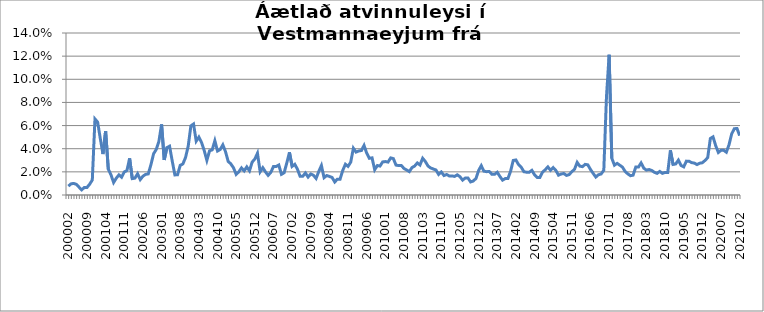
| Category | Series 0 |
|---|---|
| 200002 | 0.008 |
| 200003 | 0.01 |
| 200004 | 0.01 |
| 200005 | 0.009 |
| 200006 | 0.007 |
| 200007 | 0.004 |
| 200008 | 0.006 |
| 200009 | 0.006 |
| 200010 | 0.009 |
| 200011 | 0.013 |
| 200012 | 0.066 |
| 200101 | 0.063 |
| 200102 | 0.049 |
| 200103 | 0.035 |
| 200104 | 0.055 |
| 200105 | 0.022 |
| 200106 | 0.017 |
| 200107 | 0.011 |
| 200108 | 0.015 |
| 200109 | 0.017 |
| 200110 | 0.015 |
| 200111 | 0.02 |
| 200112 | 0.021 |
| 200201 | 0.032 |
| 200202 | 0.014 |
| 200203 | 0.015 |
| 200204 | 0.018 |
| 200205 | 0.013 |
| 200206 | 0.016 |
| 200207 | 0.018 |
| 200208 | 0.018 |
| 200209 | 0.026 |
| 200210 | 0.036 |
| 200211 | 0.039 |
| 200212 | 0.046 |
| 200301 | 0.061 |
| 200302 | 0.03 |
| 200303 | 0.041 |
| 200304 | 0.042 |
| 200305 | 0.029 |
| 200306 | 0.017 |
| 200307 | 0.017 |
| 200308 | 0.026 |
| 200309 | 0.027 |
| 200310 | 0.032 |
| 200311 | 0.042 |
| 200312 | 0.06 |
| 200401 | 0.061 |
| 200402 | 0.047 |
| 200403 | 0.05 |
| 200404 | 0.045 |
| 200405 | 0.038 |
| 200406 | 0.03 |
| 200407 | 0.038 |
| 200408 | 0.039 |
| 200409 | 0.047 |
| 200410 | 0.038 |
| 200411 | 0.039 |
| 200412 | 0.043 |
| 200501 | 0.037 |
| 200502 | 0.029 |
| 200503 | 0.027 |
| 200504 | 0.023 |
| 200505 | 0.018 |
| 200506 | 0.02 |
| 200507 | 0.023 |
| 200508 | 0.021 |
| 200509 | 0.024 |
| 200510 | 0.021 |
| 200511 | 0.028 |
| 200512 | 0.031 |
| 200601 | 0.036 |
| 200602 | 0.02 |
| 200603 | 0.024 |
| 200604 | 0.02 |
| 200605 | 0.017 |
| 200606 | 0.02 |
| 200607 | 0.025 |
| 200608 | 0.025 |
| 200609 | 0.026 |
| 200610 | 0.018 |
| 200611 | 0.019 |
| 200612 | 0.028 |
| 200701 | 0.037 |
| 200702 | 0.025 |
| 200703 | 0.027 |
| 200704 | 0.022 |
| 200705 | 0.016 |
| 200706 | 0.016 |
| 200707 | 0.019 |
| 200708 | 0.016 |
| 200709 | 0.018 |
| 200710 | 0.017 |
| 200711 | 0.014 |
| 200712 | 0.02 |
| 200801 | 0.025 |
| 200802 | 0.015 |
| 200803 | 0.017 |
| 200804 | 0.016 |
| 200805 | 0.015 |
| 200806 | 0.011 |
| 200807 | 0.014 |
| 200808 | 0.014 |
| 200809 | 0.021 |
| 200810 | 0.027 |
| 200811 | 0.025 |
| 200812 | 0.028 |
| 200901 | 0.04 |
| 200902 | 0.037 |
| 200903 | 0.038 |
| 200904 | 0.038 |
| 200905 | 0.043 |
| 200906 | 0.036 |
| 200907 | 0.032 |
| 200908 | 0.032 |
| 200909 | 0.022 |
| 200910 | 0.025 |
| 200911 | 0.025 |
| 200912 | 0.029 |
| 201001 | 0.029 |
| 201002 | 0.028 |
| 201003 | 0.032 |
| 201004 | 0.031 |
| 201005 | 0.026 |
| 201006 | 0.025 |
| 201007 | 0.026 |
| 201008 | 0.023 |
| 201009 | 0.022 |
| 201010 | 0.02 |
| 201011 | 0.024 |
| 201012 | 0.025 |
| 201101 | 0.028 |
| 201102 | 0.026 |
| 201103 | 0.032 |
| 201104 | 0.029 |
| 201105 | 0.025 |
| 201106 | 0.023 |
| 201107 | 0.022 |
| 201108 | 0.022 |
| 201109 | 0.018 |
| 201110 | 0.02 |
| 201111 | 0.017 |
| 201112 | 0.018 |
| 201201 | 0.017 |
| 201202 | 0.017 |
| 201203 | 0.016 |
| 201204 | 0.017 |
| 201205 | 0.016 |
| 201206 | 0.013 |
| 201207 | 0.015 |
| 201208 | 0.015 |
| 201209 | 0.011 |
| 201210 | 0.012 |
| 201211 | 0.014 |
| 201212 | 0.021 |
| 201301 | 0.025 |
| 201302 | 0.021 |
| 201303 | 0.02 |
| 201304 | 0.02 |
| 201305 | 0.018 |
| 201306 | 0.018 |
| 201307 | 0.02 |
| 201308 | 0.016 |
| 201309 | 0.013 |
| 201310 | 0.014 |
| 201311 | 0.014 |
| 201312 | 0.02 |
| 201401 | 0.03 |
| 201402 | 0.03 |
| 201403 | 0.026 |
| 201404 | 0.024 |
| 201405 | 0.02 |
| 201406 | 0.02 |
| 201407 | 0.02 |
| 201408 | 0.021 |
| 201409 | 0.017 |
| 201410 | 0.015 |
| 201411 | 0.015 |
| 201412 | 0.02 |
| 201501 | 0.022 |
| 201502 | 0.024 |
| 201503 | 0.021 |
| 201504 | 0.024 |
| 201505 | 0.021 |
| 201506 | 0.017 |
| 201507 | 0.018 |
| 201508 | 0.019 |
| 201509 | 0.017 |
| 201510 | 0.018 |
| 201511 | 0.02 |
| 201512 | 0.022 |
| 201601 | 0.028 |
| 201602 | 0.025 |
| 201603 | 0.025 |
| 201604 | 0.026 |
| 201605 | 0.026 |
| 201606 | 0.022 |
| 201607 | 0.019 |
| 201608 | 0.016 |
| 201609 | 0.018 |
| 201610 | 0.018 |
| 201611 | 0.021 |
| 201612 | 0.085 |
| 201701 | 0.121 |
| 201702 | 0.032 |
| 201703 | 0.026 |
| 201704 | 0.027 |
| 201705 | 0.026 |
| 201706 | 0.024 |
| 201707 | 0.02 |
| 201708 | 0.018 |
| 201709 | 0.017 |
| 201710 | 0.017 |
| 201711 | 0.024 |
| 201712 | 0.024 |
| 201801 | 0.028 |
| 201802 | 0.023 |
| 201803 | 0.022 |
| 201804 | 0.022 |
| 201805 | 0.021 |
| 201806 | 0.02 |
| 201807 | 0.019 |
| 201808 | 0.02 |
| 201809 | 0.019 |
| 201810 | 0.02 |
| 201811 | 0.02 |
| 201812 | 0.039 |
| 201901 | 0.026 |
| 201902 | 0.027 |
| 201903 | 0.03 |
| 201904 | 0.026 |
| 201905 | 0.024 |
| 201906 | 0.029 |
| 201907 | 0.029 |
| 201908 | 0.028 |
| 201909 | 0.028 |
| 201910 | 0.026 |
| 201911 | 0.027 |
| 201912 | 0.028 |
| 202001 | 0.03 |
| 202002 | 0.032 |
| 202003 | 0.049 |
| 202004 | 0.05 |
| 202005 | 0.043 |
| 202006 | 0.037 |
| 202007 | 0.039 |
| 202008 | 0.039 |
| 202009 | 0.037 |
| 202010 | 0.043 |
| 202011 | 0.053 |
| 202012 | 0.057 |
| 202101 | 0.057 |
| 202102 | 0.051 |